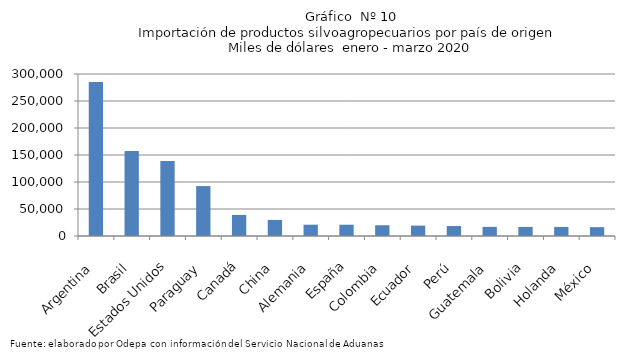
| Category | Series 0 |
|---|---|
| Argentina | 285159.449 |
| Brasil | 157540.506 |
| Estados Unidos | 138829.169 |
| Paraguay | 92463.297 |
| Canadá | 39038.414 |
| China | 29751.726 |
| Alemania | 20907.719 |
| España | 20891.621 |
| Colombia | 19866.138 |
| Ecuador | 19270.371 |
| Perú | 18431.49 |
| Guatemala | 16873.618 |
| Bolivia | 16832.441 |
| Holanda | 16779.958 |
| México | 16382.539 |